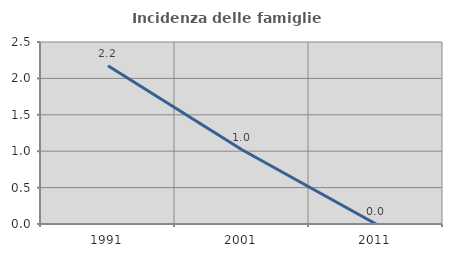
| Category | Incidenza delle famiglie numerose |
|---|---|
| 1991.0 | 2.174 |
| 2001.0 | 1.02 |
| 2011.0 | 0 |